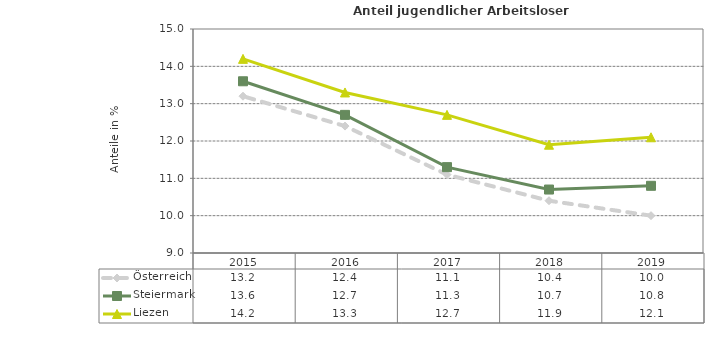
| Category | Österreich | Steiermark | Liezen |
|---|---|---|---|
| 2019.0 | 10 | 10.8 | 12.1 |
| 2018.0 | 10.4 | 10.7 | 11.9 |
| 2017.0 | 11.1 | 11.3 | 12.7 |
| 2016.0 | 12.4 | 12.7 | 13.3 |
| 2015.0 | 13.2 | 13.6 | 14.2 |